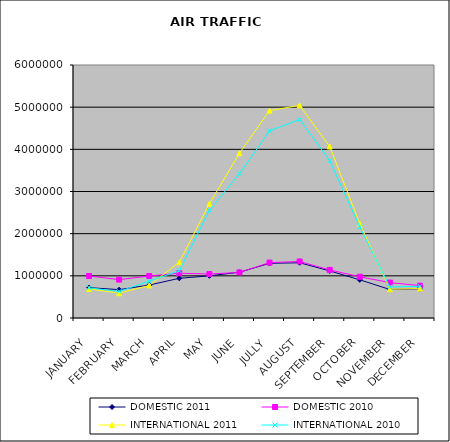
| Category | DOMESTIC 2011 | DOMESTIC 2010 | INTERNATIONAL 2011 | INTERNATIONAL 2010 |
|---|---|---|---|---|
| JANUARY | 721027 | 995741 | 690447 | 715921 |
| FEBRUARY | 671939 | 910795 | 586949 | 629896 |
| MARCH | 781323 | 995814 | 772105 | 873552 |
| APRIL | 941397 | 1061434 | 1321447 | 1118941 |
| MAY | 999706 | 1042777 | 2707386 | 2552050 |
| JUNE | 1085296 | 1080929 | 3908577 | 3422267 |
| JULLY | 1296239 | 1313789 | 4917320 | 4436406 |
| AUGUST | 1309822 | 1340207 | 5042617 | 4708164 |
| SEPTEMBER | 1117006 | 1140560 | 4066836 | 3730670 |
| OCTOBER | 905226 | 977863 | 2239166 | 2160969 |
| NOVEMBER | 676598 | 840411 | 681422 | 735388 |
| DECEMBER | 691989 | 767141 | 699482 | 751888 |